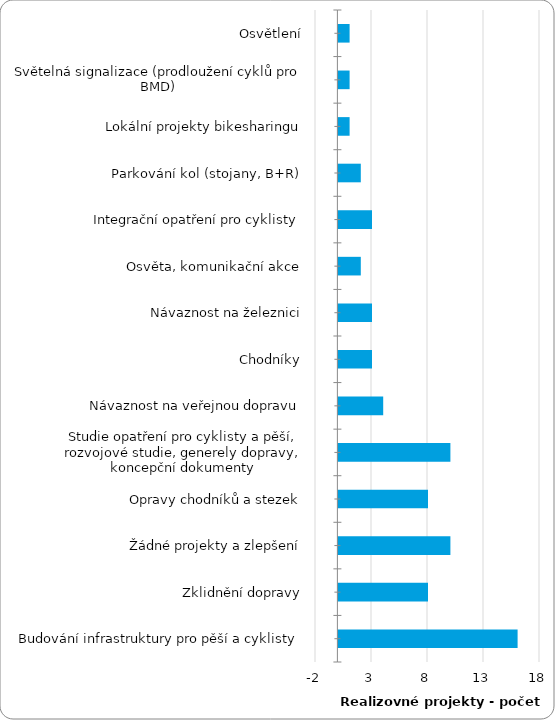
| Category | Series 0 |
|---|---|
| Osvětlení | 1 |
| Světelná signalizace (prodloužení cyklů pro BMD) | 1 |
| Lokální projekty bikesharingu | 1 |
| Parkování kol (stojany, B+R) | 2 |
| Integrační opatření pro cyklisty | 3 |
| Osvěta, komunikační akce | 2 |
| Návaznost na železnici | 3 |
| Chodníky | 3 |
| Návaznost na veřejnou dopravu | 4 |
| Studie opatření pro cyklisty a pěší, rozvojové studie, generely dopravy, koncepční dokumenty | 10 |
| Opravy chodníků a stezek | 8 |
| Žádné projekty a zlepšení | 10 |
| Zklidnění dopravy | 8 |
| Budování infrastruktury pro pěší a cyklisty | 16 |